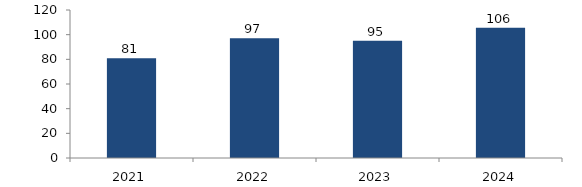
| Category | Bogotá |
|---|---|
| 2021.0 | 80.814 |
| 2022.0 | 97.068 |
| 2023.0 | 95.167 |
| 2024.0 | 105.512 |